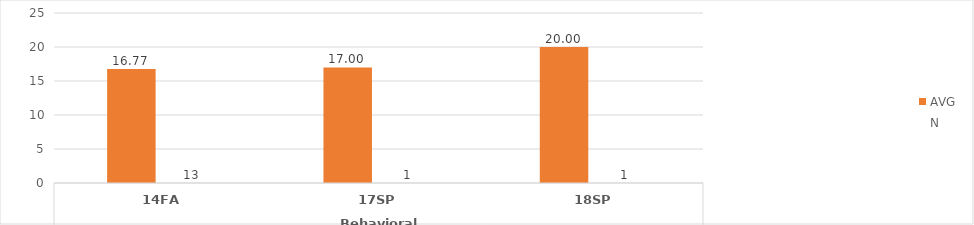
| Category | Information Literacy - AVG | Information Literacy - N |
|---|---|---|
| 0 | 16.769 | 13 |
| 1 | 17 | 1 |
| 2 | 20 | 1 |